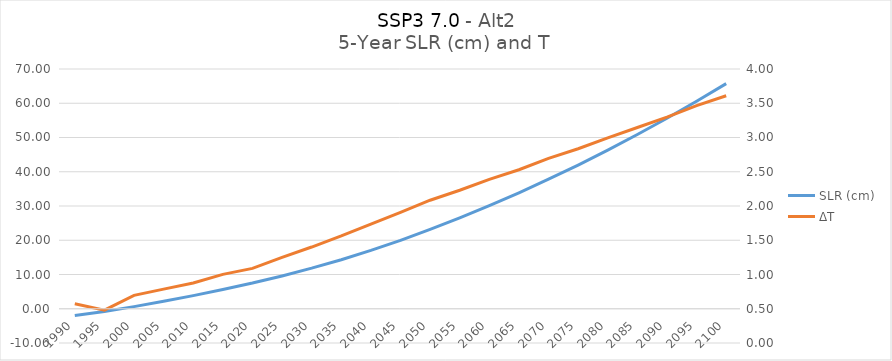
| Category | SLR (cm) |
|---|---|
| 1990.0 | -1.941 |
| 1995.0 | -0.818 |
| 2000.0 | 0.621 |
| 2005.0 | 2.18 |
| 2010.0 | 3.834 |
| 2015.0 | 5.633 |
| 2020.0 | 7.505 |
| 2025.0 | 9.582 |
| 2030.0 | 11.846 |
| 2035.0 | 14.321 |
| 2040.0 | 17.03 |
| 2045.0 | 19.967 |
| 2050.0 | 23.152 |
| 2055.0 | 26.519 |
| 2060.0 | 30.098 |
| 2065.0 | 33.847 |
| 2070.0 | 37.818 |
| 2075.0 | 41.963 |
| 2080.0 | 46.317 |
| 2085.0 | 50.865 |
| 2090.0 | 55.603 |
| 2095.0 | 60.572 |
| 2100.0 | 65.723 |